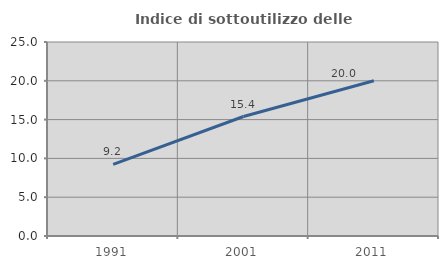
| Category | Indice di sottoutilizzo delle abitazioni  |
|---|---|
| 1991.0 | 9.222 |
| 2001.0 | 15.396 |
| 2011.0 | 20 |